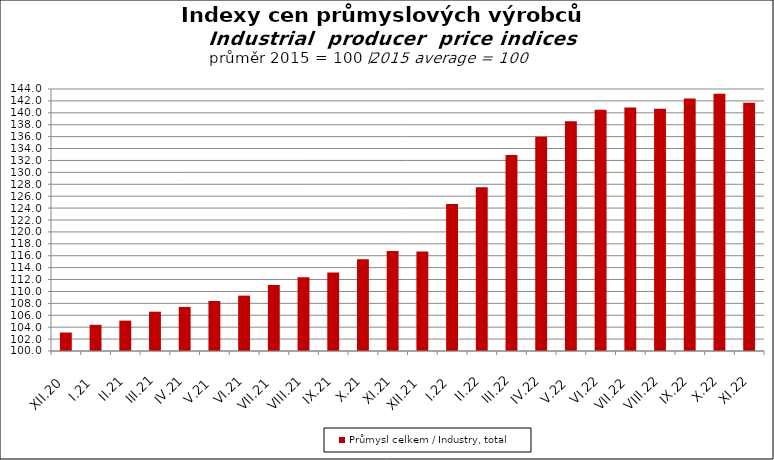
| Category | Průmysl celkem / Industry, total |
|---|---|
| XII.20 | 103.1 |
| I.21 | 104.4 |
| II.21 | 105.1 |
| III.21 | 106.6 |
| IV.21 | 107.4 |
| V.21 | 108.4 |
| VI.21 | 109.3 |
| VII.21 | 111.1 |
| VIII.21 | 112.4 |
| IX.21 | 113.2 |
| X.21 | 115.4 |
| XI.21 | 116.8 |
| XII.21 | 116.7 |
| I.22 | 124.7 |
| II.22 | 127.5 |
| III.22 | 132.9 |
| IV.22 | 136 |
| V.22 | 138.6 |
| VI.22 | 140.5 |
| VII.22 | 140.9 |
| VIII.22 | 140.7 |
| IX.22 | 142.4 |
| X.22 | 143.2 |
| XI.22 | 141.7 |